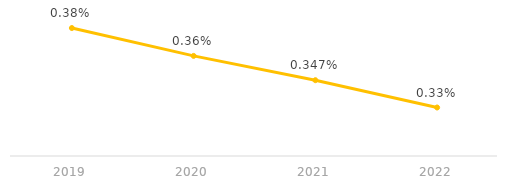
| Category | Series 0 |
|---|---|
| 2019.0 | 0.004 |
| 2020.0 | 0.004 |
| 2021.0 | 0.003 |
| 2022.0 | 0.003 |